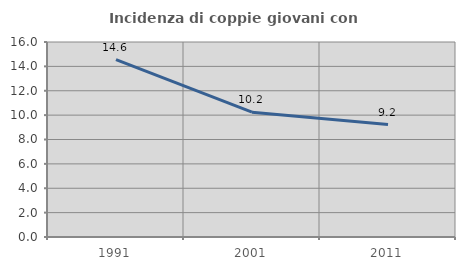
| Category | Incidenza di coppie giovani con figli |
|---|---|
| 1991.0 | 14.562 |
| 2001.0 | 10.242 |
| 2011.0 | 9.225 |